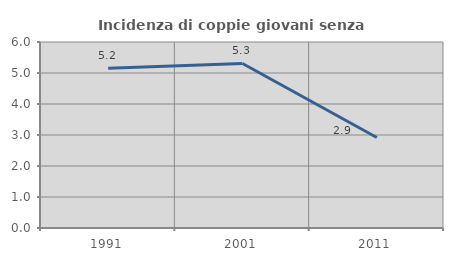
| Category | Incidenza di coppie giovani senza figli |
|---|---|
| 1991.0 | 5.152 |
| 2001.0 | 5.308 |
| 2011.0 | 2.921 |